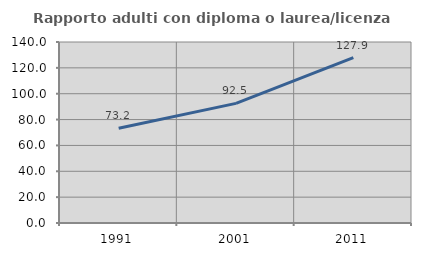
| Category | Rapporto adulti con diploma o laurea/licenza media  |
|---|---|
| 1991.0 | 73.228 |
| 2001.0 | 92.508 |
| 2011.0 | 127.885 |